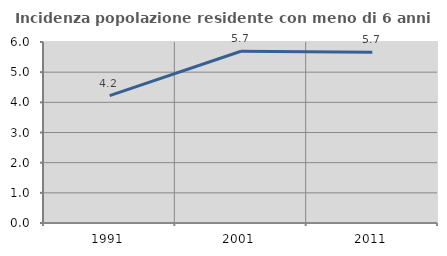
| Category | Incidenza popolazione residente con meno di 6 anni |
|---|---|
| 1991.0 | 4.225 |
| 2001.0 | 5.694 |
| 2011.0 | 5.664 |